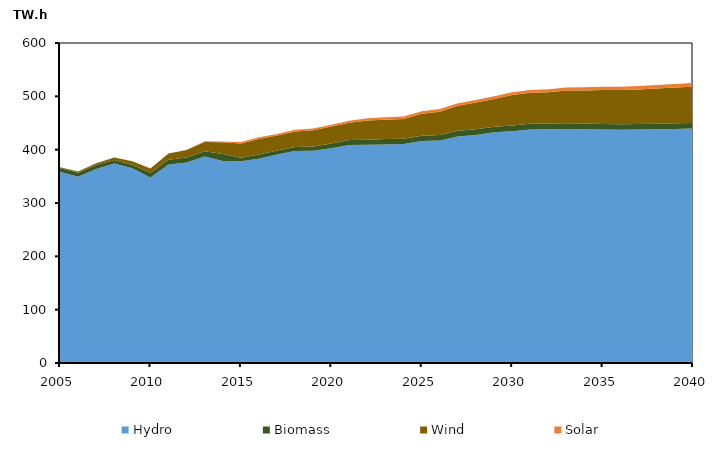
| Category | Hydro | Biomass | Wind | Solar |
|---|---|---|---|---|
| 2005.0 | 358.396 | 7.267 | 1.453 | 0 |
| 2006.0 | 349.14 | 7.413 | 2.529 | 0 |
| 2007.0 | 363.814 | 7.241 | 3.683 | 0 |
| 2008.0 | 373.832 | 6.613 | 4.715 | 0 |
| 2009.0 | 365.042 | 6.238 | 7.031 | 0.005 |
| 2010.0 | 347.965 | 8.563 | 8.354 | 0.123 |
| 2011.0 | 371.979 | 9.026 | 11.623 | 0.398 |
| 2012.0 | 375.787 | 9.392 | 13.997 | 0.842 |
| 2013.0 | 387.411 | 9.546 | 17.545 | 1.173 |
| 2014.0 | 378.802 | 12.961 | 22.01 | 1.758 |
| 2015.0 | 378.112 | 6.589 | 26.632 | 2.954 |
| 2016.0 | 383.055 | 8.081 | 28.825 | 3.238 |
| 2017.0 | 391.08 | 7.434 | 28.009 | 2.988 |
| 2018.0 | 397.325 | 7.787 | 29.146 | 3.197 |
| 2019.0 | 397.943 | 7.967 | 30.52 | 3.316 |
| 2020.0 | 402.637 | 8.905 | 31.856 | 3.388 |
| 2021.0 | 408.863 | 9.158 | 32.504 | 3.682 |
| 2022.0 | 409.183 | 9.326 | 36.151 | 4.44 |
| 2023.0 | 409.881 | 9.965 | 36.3 | 4.479 |
| 2024.0 | 410.489 | 10 | 36.957 | 4.59 |
| 2025.0 | 416.077 | 10.101 | 41.192 | 4.809 |
| 2026.0 | 417.105 | 10.272 | 43.848 | 4.912 |
| 2027.0 | 424.852 | 10.48 | 46.871 | 4.998 |
| 2028.0 | 427.356 | 10.936 | 49.945 | 5.099 |
| 2029.0 | 432.48 | 10.662 | 51.686 | 5.158 |
| 2030.0 | 434.571 | 10.63 | 57.191 | 5.306 |
| 2031.0 | 437.778 | 10.699 | 58.11 | 5.365 |
| 2032.0 | 438.18 | 10.702 | 58.796 | 5.495 |
| 2033.0 | 438.543 | 11.047 | 61.569 | 5.556 |
| 2034.0 | 438.336 | 10.559 | 62.253 | 5.714 |
| 2035.0 | 437.775 | 10.377 | 63.608 | 5.986 |
| 2036.0 | 437.174 | 10.385 | 64.33 | 6.226 |
| 2037.0 | 437.66 | 10.397 | 64.818 | 6.414 |
| 2038.0 | 438.155 | 10.407 | 66.113 | 6.514 |
| 2039.0 | 438.898 | 10.423 | 67.083 | 6.686 |
| 2040.0 | 439.515 | 10.43 | 68.042 | 6.899 |